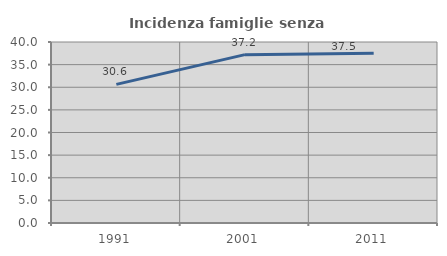
| Category | Incidenza famiglie senza nuclei |
|---|---|
| 1991.0 | 30.631 |
| 2001.0 | 37.209 |
| 2011.0 | 37.5 |